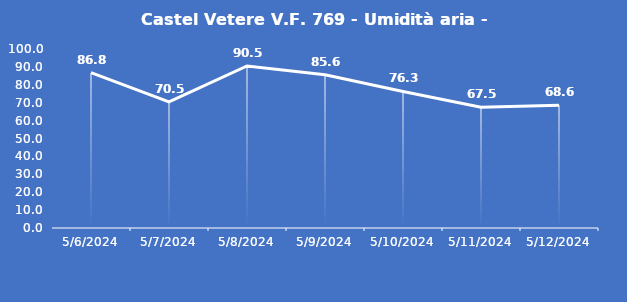
| Category | Castel Vetere V.F. 769 - Umidità aria - Grezzo (%) |
|---|---|
| 5/6/24 | 86.8 |
| 5/7/24 | 70.5 |
| 5/8/24 | 90.5 |
| 5/9/24 | 85.6 |
| 5/10/24 | 76.3 |
| 5/11/24 | 67.5 |
| 5/12/24 | 68.6 |